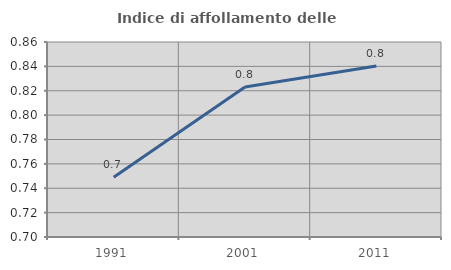
| Category | Indice di affollamento delle abitazioni  |
|---|---|
| 1991.0 | 0.749 |
| 2001.0 | 0.823 |
| 2011.0 | 0.84 |